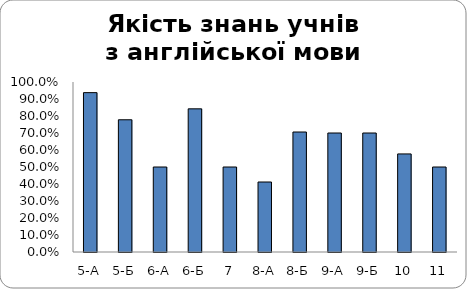
| Category | Series 0 |
|---|---|
| 5-А | 0.938 |
| 5-Б | 0.778 |
| 6-А | 0.5 |
| 6-Б | 0.842 |
| 7 | 0.5 |
| 8-А | 0.412 |
| 8-Б | 0.706 |
| 9-А | 0.7 |
| 9-Б | 0.7 |
| 10 | 0.577 |
| 11 | 0.5 |